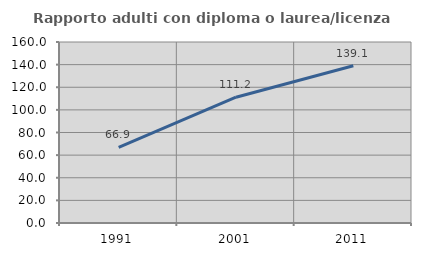
| Category | Rapporto adulti con diploma o laurea/licenza media  |
|---|---|
| 1991.0 | 66.86 |
| 2001.0 | 111.22 |
| 2011.0 | 139.07 |